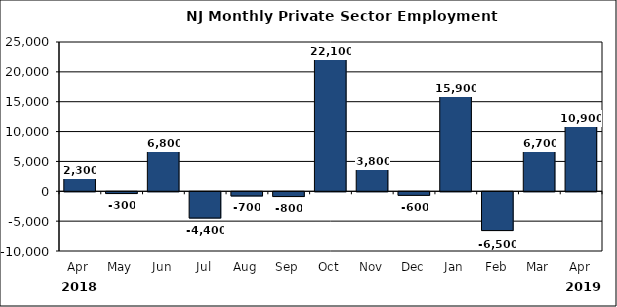
| Category | Series 0 |
|---|---|
| Apr | 2300 |
| May | -300 |
| Jun | 6800 |
| Jul | -4400 |
| Aug | -700 |
| Sep | -800 |
| Oct | 22100 |
| Nov | 3800 |
| Dec | -600 |
| Jan | 15900 |
| Feb | -6500 |
| Mar | 6700 |
| Apr | 10900 |